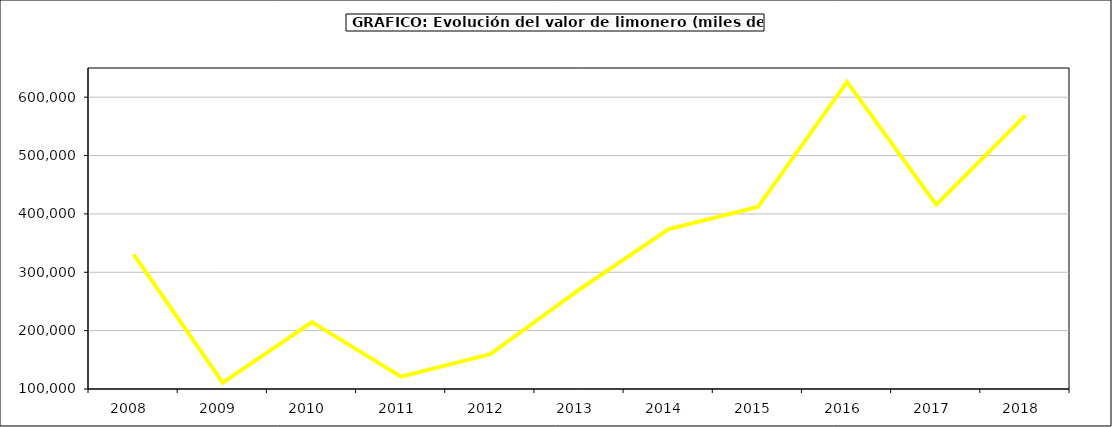
| Category | Valor |
|---|---|
| 2008.0 | 330828.422 |
| 2009.0 | 110910.366 |
| 2010.0 | 214653.894 |
| 2011.0 | 121030.951 |
| 2012.0 | 159689.894 |
| 2013.0 | 270510.614 |
| 2014.0 | 373950.238 |
| 2015.0 | 411737 |
| 2016.0 | 626329 |
| 2017.0 | 415897.996 |
| 2018.0 | 568828.291 |